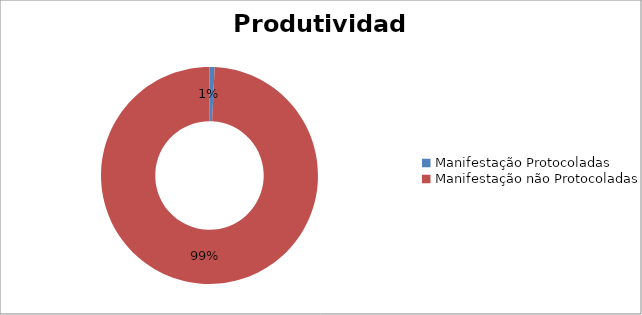
| Category | Series 0 |
|---|---|
| Manifestação Protocoladas | 0.008 |
| Manifestação não Protocoladas | 0.992 |